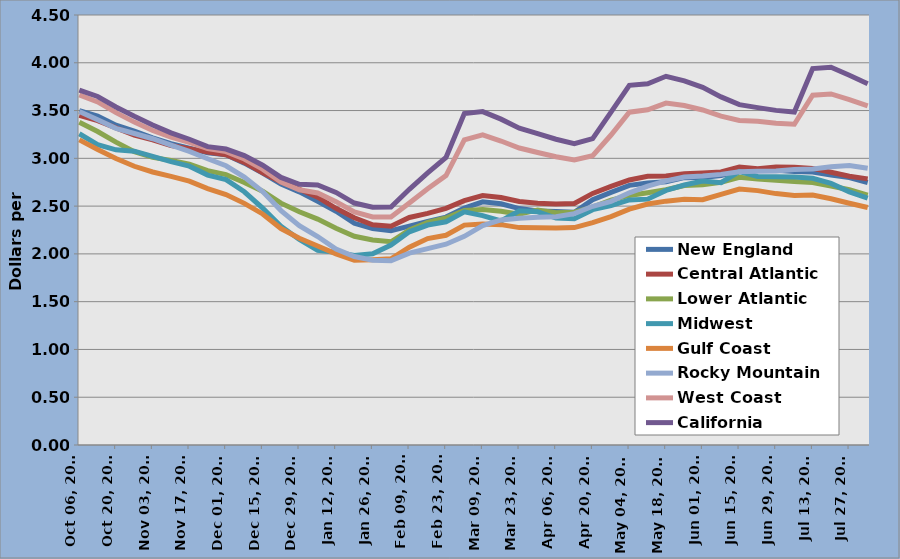
| Category | New England | Central Atlantic | Lower Atlantic | Midwest | Gulf Coast | Rocky Mountain | West Coast | California |
|---|---|---|---|---|---|---|---|---|
| 2014-10-06 | 3.498 | 3.45 | 3.378 | 3.257 | 3.193 | 3.491 | 3.663 | 3.714 |
| 2014-10-13 | 3.443 | 3.394 | 3.281 | 3.144 | 3.093 | 3.403 | 3.59 | 3.647 |
| 2014-10-20 | 3.347 | 3.318 | 3.169 | 3.089 | 2.999 | 3.314 | 3.478 | 3.538 |
| 2014-10-27 | 3.286 | 3.244 | 3.069 | 3.075 | 2.917 | 3.26 | 3.379 | 3.44 |
| 2014-11-03 | 3.214 | 3.194 | 3.01 | 3.02 | 2.857 | 3.205 | 3.291 | 3.348 |
| 2014-11-10 | 3.153 | 3.134 | 2.979 | 2.966 | 2.811 | 3.138 | 3.222 | 3.266 |
| 2014-11-17 | 3.107 | 3.102 | 2.938 | 2.918 | 2.761 | 3.073 | 3.167 | 3.2 |
| 2014-11-24 | 3.058 | 3.065 | 2.871 | 2.825 | 2.683 | 2.996 | 3.101 | 3.122 |
| 2014-12-01 | 3.038 | 3.038 | 2.83 | 2.778 | 2.621 | 2.922 | 3.07 | 3.097 |
| 2014-12-08 | 2.95 | 2.957 | 2.748 | 2.65 | 2.529 | 2.804 | 2.993 | 3.028 |
| 2014-12-15 | 2.845 | 2.849 | 2.656 | 2.479 | 2.418 | 2.652 | 2.887 | 2.928 |
| 2014-12-22 | 2.732 | 2.753 | 2.531 | 2.288 | 2.265 | 2.453 | 2.753 | 2.8 |
| 2014-12-29 | 2.649 | 2.676 | 2.441 | 2.151 | 2.163 | 2.296 | 2.671 | 2.728 |
| 2015-01-05 | 2.55 | 2.594 | 2.364 | 2.038 | 2.082 | 2.182 | 2.638 | 2.721 |
| 2015-01-12 | 2.446 | 2.477 | 2.268 | 2.018 | 2 | 2.051 | 2.547 | 2.643 |
| 2015-01-19 | 2.32 | 2.378 | 2.184 | 1.984 | 1.933 | 1.972 | 2.438 | 2.532 |
| 2015-01-26 | 2.264 | 2.304 | 2.146 | 2.001 | 1.939 | 1.934 | 2.387 | 2.489 |
| 2015-02-02 | 2.242 | 2.289 | 2.127 | 2.093 | 1.949 | 1.929 | 2.386 | 2.491 |
| 2015-02-09 | 2.29 | 2.381 | 2.25 | 2.231 | 2.07 | 2.008 | 2.533 | 2.676 |
| 2015-02-16 | 2.34 | 2.424 | 2.329 | 2.302 | 2.16 | 2.055 | 2.681 | 2.847 |
| 2015-02-23 | 2.385 | 2.476 | 2.375 | 2.336 | 2.195 | 2.101 | 2.819 | 3.009 |
| 2015-03-02 | 2.48 | 2.557 | 2.455 | 2.44 | 2.301 | 2.184 | 3.194 | 3.468 |
| 2015-03-09 | 2.545 | 2.61 | 2.464 | 2.4 | 2.313 | 2.296 | 3.245 | 3.489 |
| 2015-03-16 | 2.524 | 2.59 | 2.446 | 2.344 | 2.306 | 2.355 | 3.181 | 3.41 |
| 2015-03-23 | 2.474 | 2.549 | 2.416 | 2.451 | 2.275 | 2.372 | 3.108 | 3.316 |
| 2015-03-30 | 2.45 | 2.529 | 2.46 | 2.44 | 2.273 | 2.383 | 3.061 | 3.258 |
| 2015-04-06 | 2.443 | 2.522 | 2.43 | 2.375 | 2.271 | 2.389 | 3.017 | 3.2 |
| 2015-04-13 | 2.435 | 2.528 | 2.436 | 2.367 | 2.275 | 2.421 | 2.983 | 3.153 |
| 2015-04-20 | 2.566 | 2.633 | 2.489 | 2.463 | 2.328 | 2.498 | 3.028 | 3.207 |
| 2015-04-27 | 2.644 | 2.706 | 2.563 | 2.506 | 2.391 | 2.55 | 3.244 | 3.483 |
| 2015-05-04 | 2.717 | 2.774 | 2.612 | 2.565 | 2.468 | 2.639 | 3.483 | 3.764 |
| 2015-05-11 | 2.741 | 2.812 | 2.64 | 2.573 | 2.522 | 2.71 | 3.508 | 3.781 |
| 2015-05-18 | 2.756 | 2.815 | 2.671 | 2.664 | 2.552 | 2.764 | 3.578 | 3.859 |
| 2015-05-25 | 2.798 | 2.839 | 2.716 | 2.721 | 2.572 | 2.805 | 3.553 | 3.811 |
| 2015-06-01 | 2.8 | 2.846 | 2.723 | 2.762 | 2.567 | 2.814 | 3.506 | 3.743 |
| 2015-06-08 | 2.82 | 2.857 | 2.748 | 2.745 | 2.623 | 2.832 | 3.441 | 3.643 |
| 2015-06-15 | 2.864 | 2.908 | 2.802 | 2.862 | 2.678 | 2.86 | 3.396 | 3.562 |
| 2015-06-22 | 2.883 | 2.892 | 2.784 | 2.811 | 2.662 | 2.864 | 3.389 | 3.531 |
| 2015-06-29 | 2.876 | 2.909 | 2.77 | 2.806 | 2.631 | 2.867 | 3.368 | 3.502 |
| 2015-07-06 | 2.862 | 2.906 | 2.758 | 2.805 | 2.61 | 2.882 | 3.357 | 3.484 |
| 2015-07-13 | 2.856 | 2.895 | 2.747 | 2.791 | 2.617 | 2.889 | 3.66 | 3.939 |
| 2015-07-20 | 2.825 | 2.854 | 2.711 | 2.738 | 2.577 | 2.911 | 3.674 | 3.954 |
| 2015-07-27 | 2.798 | 2.812 | 2.671 | 2.649 | 2.53 | 2.925 | 3.615 | 3.869 |
| 2015-08-03 | 2.747 | 2.785 | 2.615 | 2.584 | 2.485 | 2.897 | 3.549 | 3.781 |